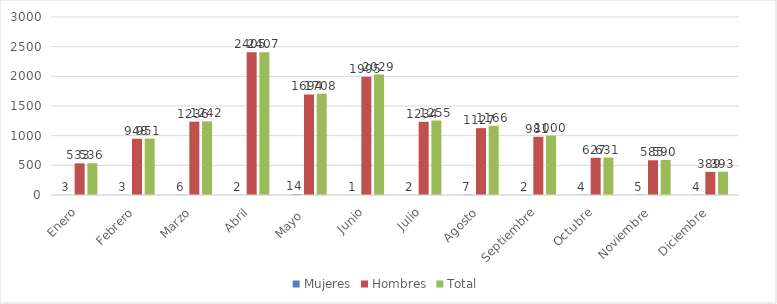
| Category | Mujeres | Hombres | Total |
|---|---|---|---|
| Enero | 3 | 533 | 536 |
| Febrero | 3 | 948 | 951 |
| Marzo | 6 | 1236 | 1242 |
| Abril | 2 | 2405 | 2407 |
| Mayo  | 14 | 1694 | 1708 |
| Junio | 1 | 1995 | 2029 |
| Julio | 2 | 1234 | 1255 |
| Agosto | 7 | 1127 | 1166 |
| Septiembre | 2 | 981 | 1000 |
| Octubre | 4 | 627 | 631 |
| Noviembre | 5 | 585 | 590 |
| Diciembre | 4 | 389 | 393 |